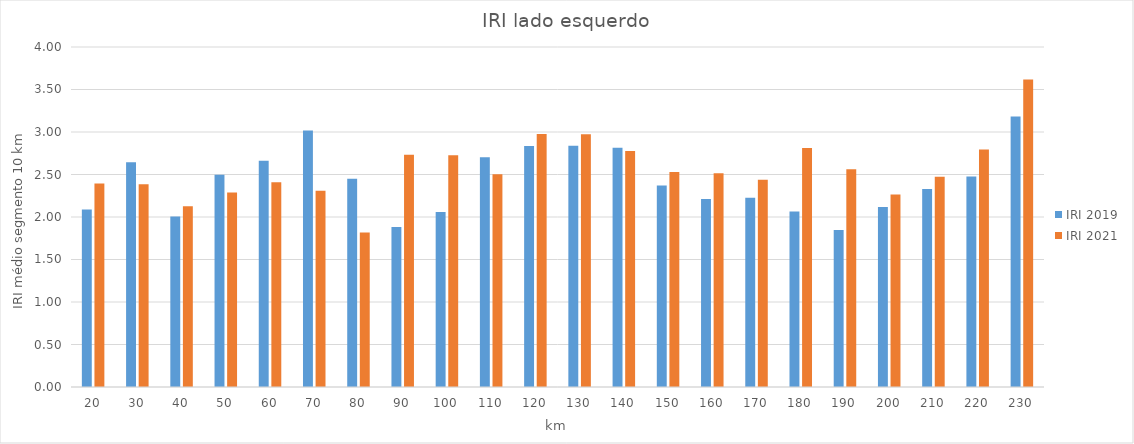
| Category | IRI 2019 | IRI 2021 |
|---|---|---|
| 20.0 | 2.089 | 2.393 |
| 30.0 | 2.643 | 2.386 |
| 40.0 | 2.005 | 2.126 |
| 50.0 | 2.497 | 2.288 |
| 60.0 | 2.663 | 2.41 |
| 70.0 | 3.018 | 2.308 |
| 80.0 | 2.45 | 1.817 |
| 90.0 | 1.884 | 2.734 |
| 100.0 | 2.06 | 2.726 |
| 110.0 | 2.704 | 2.502 |
| 120.0 | 2.835 | 2.977 |
| 130.0 | 2.839 | 2.975 |
| 140.0 | 2.815 | 2.777 |
| 150.0 | 2.369 | 2.529 |
| 160.0 | 2.211 | 2.515 |
| 170.0 | 2.228 | 2.437 |
| 180.0 | 2.065 | 2.811 |
| 190.0 | 1.846 | 2.56 |
| 200.0 | 2.119 | 2.264 |
| 210.0 | 2.328 | 2.473 |
| 220.0 | 2.475 | 2.793 |
| 230.0 | 3.182 | 3.617 |